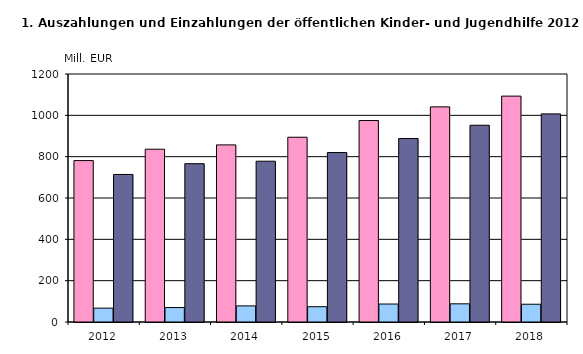
| Category | Ausgaben insgesamt | Einnahmen insgesamt | reine Ausgaben insgesamt |
|---|---|---|---|
| 2012.0 | 781 | 67 | 714 |
| 2013.0 | 836 | 70 | 766 |
| 2014.0 | 857 | 78 | 778 |
| 2015.0 | 894 | 74 | 820 |
| 2016.0 | 975 | 87 | 888 |
| 2017.0 | 1041 | 88 | 952 |
| 2018.0 | 1093 | 86 | 1007 |